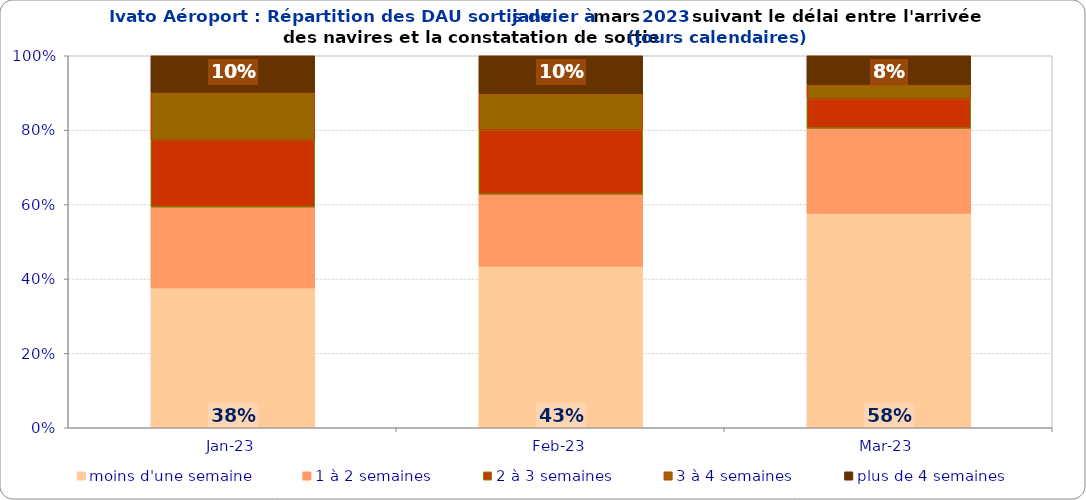
| Category | moins d'une semaine | 1 à 2 semaines | 2 à 3 semaines | 3 à 4 semaines | plus de 4 semaines |
|---|---|---|---|---|---|
| 2023-01-01 | 0.376 | 0.217 | 0.18 | 0.129 | 0.098 |
| 2023-02-01 | 0.434 | 0.194 | 0.173 | 0.098 | 0.102 |
| 2023-03-01 | 0.577 | 0.229 | 0.08 | 0.038 | 0.078 |